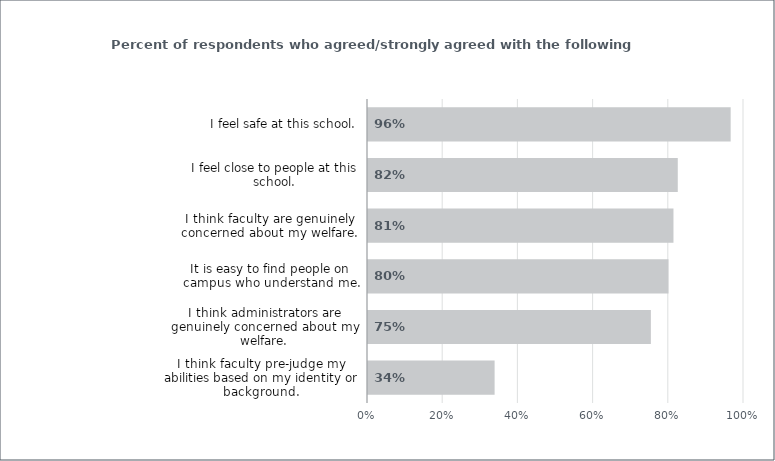
| Category | Series 0 |
|---|---|
| I think faculty pre-judge my abilities based on my identity or background. | 0.337 |
| I think administrators are genuinely concerned about my welfare. | 0.752 |
| It is easy to find people on campus who understand me. | 0.799 |
| I think faculty are genuinely concerned about my welfare. | 0.812 |
| I feel close to people at this school. | 0.824 |
| I feel safe at this school. | 0.965 |